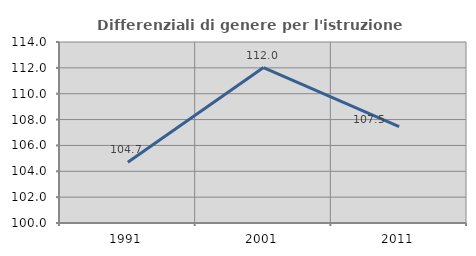
| Category | Differenziali di genere per l'istruzione superiore |
|---|---|
| 1991.0 | 104.703 |
| 2001.0 | 112.025 |
| 2011.0 | 107.464 |